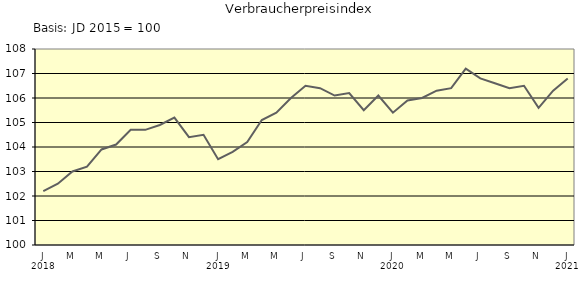
| Category | Series 0 |
|---|---|
| 0 | 102.2 |
| 1 | 102.5 |
| 2 | 103 |
| 3 | 103.2 |
| 4 | 103.9 |
| 5 | 104.1 |
| 6 | 104.7 |
| 7 | 104.7 |
| 8 | 104.9 |
| 9 | 105.2 |
| 10 | 104.4 |
| 11 | 104.5 |
| 12 | 103.5 |
| 13 | 103.8 |
| 14 | 104.2 |
| 15 | 105.1 |
| 16 | 105.4 |
| 17 | 106 |
| 18 | 106.5 |
| 19 | 106.4 |
| 20 | 106.1 |
| 21 | 106.2 |
| 22 | 105.5 |
| 23 | 106.1 |
| 24 | 105.4 |
| 25 | 105.9 |
| 26 | 106 |
| 27 | 106.3 |
| 28 | 106.4 |
| 29 | 107.2 |
| 30 | 106.8 |
| 31 | 106.6 |
| 32 | 106.4 |
| 33 | 106.5 |
| 34 | 105.6 |
| 35 | 106.3 |
| 36 | 106.8 |